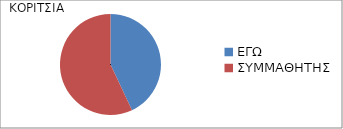
| Category | Series 0 |
|---|---|
| ΕΓΩ | 0.43 |
| ΣΥΜΜΑΘΗΤΗΣ | 0.57 |